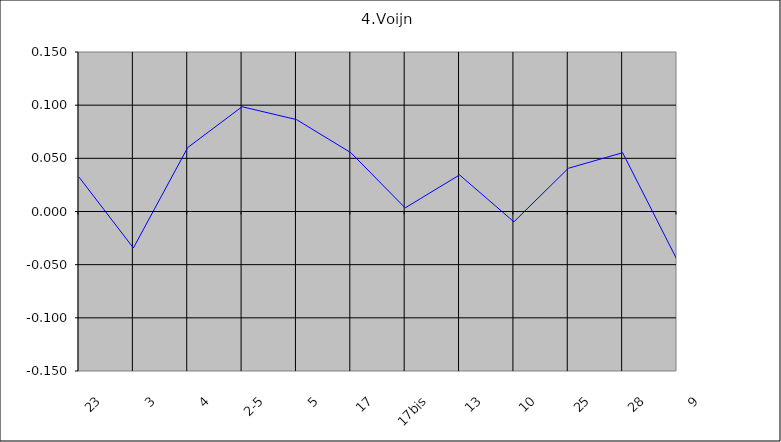
| Category | Voïjin |
|---|---|
| 23 | 0.032 |
| 3 | -0.034 |
| 4 | 0.06 |
| 2-5 | 0.099 |
| 5 | 0.086 |
| 17 | 0.055 |
| 17bis | 0.003 |
| 13 | 0.034 |
| 10 | -0.01 |
| 25 | 0.041 |
| 28 | 0.055 |
| 9 | -0.045 |